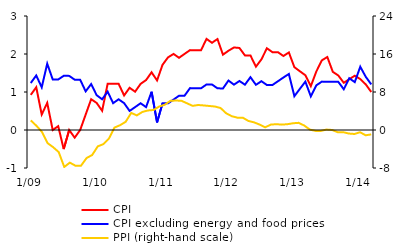
| Category | CPI | CPI excluding energy and food prices |
|---|---|---|
| 1/09 | 0.924 | 1.236 |
| 2 | 1.125 | 1.434 |
| 3 | 0.407 | 1.124 |
| 4 | 0.714 | 1.745 |
| 5 | 0 | 1.331 |
| 6 | 0.101 | 1.329 |
| 7 | -0.503 | 1.426 |
| 8 | 0 | 1.424 |
| 9 | -0.202 | 1.324 |
| 10 | 0 | 1.322 |
| 11 | 0.407 | 1.017 |
| 12 | 0.81 | 1.21 |
| 1/10 | 0.712 | 0.916 |
| 2 | 0.506 | 0.808 |
| 3 | 1.216 | 1.01 |
| 4 | 1.215 | 0.706 |
| 5 | 1.216 | 0.808 |
| 6 | 0.909 | 0.706 |
| 7 | 1.111 | 0.502 |
| 8 | 1.008 | 0.602 |
| 9 | 1.213 | 0.704 |
| 10 | 1.314 | 0.602 |
| 11 | 1.518 | 1.007 |
| 12 | 1.305 | 0.199 |
| 1/11 | 1.717 | 0.706 |
| 2 | 1.911 | 0.701 |
| 3 | 2.002 | 0.8 |
| 4 | 1.9 | 0.902 |
| 5 | 2.002 | 0.902 |
| 6 | 2.102 | 1.102 |
| 7 | 2.098 | 1.099 |
| 8 | 2.096 | 1.097 |
| 9 | 2.398 | 1.198 |
| 10 | 2.295 | 1.198 |
| 11 | 2.393 | 1.097 |
| 12 | 1.982 | 1.093 |
| 1/12 | 2.085 | 1.301 |
| 2 | 2.172 | 1.194 |
| 3 | 2.159 | 1.29 |
| 4 | 1.963 | 1.192 |
| 5 | 1.963 | 1.39 |
| 6 | 1.667 | 1.189 |
| 7 | 1.859 | 1.285 |
| 8 | 2.151 | 1.183 |
| 9 | 2.049 | 1.183 |
| 10 | 2.049 | 1.282 |
| 11 | 1.947 | 1.381 |
| 12 | 2.041 | 1.475 |
| 1/13 | 1.654 | 0.889 |
| 2 | 1.546 | 1.082 |
| 3 | 1.441 | 1.273 |
| 4 | 1.155 | 0.883 |
| 5 | 1.54 | 1.175 |
| 6 | 1.832 | 1.273 |
| 7 | 1.921 | 1.268 |
| 8 | 1.531 | 1.267 |
| 9 | 1.434 | 1.267 |
| 10 | 1.243 | 1.071 |
| 11 | 1.337 | 1.362 |
| 12 | 1.429 | 1.26 |
| 1/14 | 1.34 | 1.665 |
| 2 | 1.2 | 1.4 |
| 3 | 1 | 1.2 |